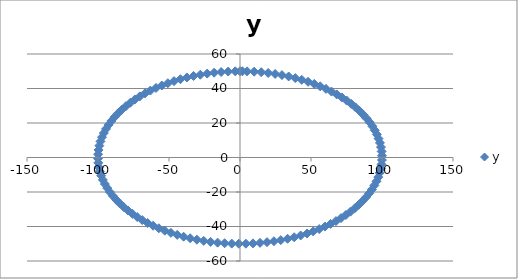
| Category | y |
|---|---|
| 0.0 | 50 |
| 4.997916927067833 | 49.938 |
| 9.983341664682815 | 49.75 |
| 14.943813247359921 | 49.439 |
| 19.866933079506122 | 49.003 |
| 24.740395925452294 | 48.446 |
| 29.552020666133956 | 47.767 |
| 34.28978074554514 | 46.969 |
| 38.941834230865055 | 46.053 |
| 43.496553411123024 | 45.022 |
| 47.942553860420304 | 43.879 |
| 52.26872289306592 | 42.626 |
| 56.46424733950354 | 41.267 |
| 60.51864057360395 | 39.804 |
| 64.4217687237691 | 38.242 |
| 68.16387600233341 | 36.584 |
| 71.73560908995228 | 34.835 |
| 75.12804051402927 | 32.999 |
| 78.33269096274834 | 31.08 |
| 81.34155047893738 | 29.084 |
| 84.14709848078965 | 27.015 |
| 86.7423225594017 | 24.879 |
| 89.12073600614355 | 22.68 |
| 91.2763940260521 | 20.424 |
| 93.20390859672263 | 18.118 |
| 94.89846193555861 | 15.766 |
| 96.3558185417193 | 13.375 |
| 97.5723357826659 | 10.95 |
| 98.54497299884602 | 8.498 |
| 99.27129910375885 | 6.025 |
| 99.74949866040545 | 3.537 |
| 99.9783764189357 | 1.04 |
| 99.95736030415051 | -1.46 |
| 99.68650284539189 | -3.956 |
| 99.16648104524685 | -6.442 |
| 98.3985946873937 | -8.912 |
| 97.38476308781952 | -11.36 |
| 96.12752029752998 | -13.78 |
| 94.63000876874145 | -16.164 |
| 92.89597150038693 | -18.509 |
| 90.92974268256818 | -20.807 |
| 88.73623686333755 | -23.054 |
| 86.32093666488737 | -25.242 |
| 83.68987907984977 | -27.368 |
| 80.849640381959 | -29.425 |
| 77.80731968879212 | -31.409 |
| 74.57052121767202 | -33.314 |
| 71.14733527908443 | -35.136 |
| 67.5463180551151 | -36.87 |
| 63.77647021345037 | -38.512 |
| 59.84721441039566 | -40.057 |
| 55.7683717391417 | -41.503 |
| 51.550137182146415 | -42.844 |
| 47.20305412898826 | -44.079 |
| 42.737988023382975 | -45.204 |
| 38.16609920523317 | -46.215 |
| 33.49881501559051 | -47.111 |
| 28.74780123425444 | -47.889 |
| 23.92493292139824 | -48.548 |
| 19.042264736102705 | -49.085 |
| 14.112000805986721 | -49.5 |
| 9.146464223243719 | -49.79 |
| 4.158066243329049 | -49.957 |
| -0.8407247367148618 | -49.998 |
| -5.8374143427580085 | -49.915 |
| -10.819513453010837 | -49.706 |
| -15.774569414324821 | -49.374 |
| -20.690197167339978 | -48.918 |
| -25.554110202683123 | -48.34 |
| -30.354151270842934 | -47.641 |
| -35.07832276896198 | -46.823 |
| -39.71481672859598 | -45.888 |
| -44.252044329485244 | -44.838 |
| -48.678664865569935 | -43.676 |
| -52.98361409084934 | -42.405 |
| -57.156131874234376 | -41.028 |
| -61.18578909427189 | -39.548 |
| -65.06251370651674 | -37.97 |
| -68.77661591839738 | -36.297 |
| -72.31881240865121 | -34.533 |
| -75.68024953079282 | -32.682 |
| -78.85252544261951 | -30.75 |
| -81.82771110644103 | -28.741 |
| -84.59837010754465 | -26.66 |
| -87.15757724135882 | -24.513 |
| -89.49893582285836 | -22.304 |
| -91.61659367494549 | -20.04 |
| -93.50525775584491 | -17.725 |
| -95.1602073889516 | -15.367 |
| -96.57730606206388 | -12.969 |
| -97.7530117665097 | -10.54 |
| -98.68438585032365 | -8.084 |
| -99.36910036334645 | -5.608 |
| -99.80544387588795 | -3.117 |
| -99.99232575641008 | -0.619 |
| -99.9292788975378 | 1.88 |
| -99.61646088358407 | 4.375 |
| -99.05465359667133 | 6.859 |
| -98.24526126243325 | 9.326 |
| -97.19030694018208 | 11.769 |
| -95.89242746631385 | 14.183 |
| -94.35486686359066 | 16.562 |
| -92.58146823277325 | 18.899 |
| -90.57666414687044 | 21.189 |
| -88.34546557201531 | 23.426 |
| -85.8934493426592 | 25.604 |
| -83.22674422239012 | 27.719 |
| -80.35201558521558 | 29.764 |
| -77.27644875559872 | 31.735 |
| -74.00773104888944 | 33.626 |
| -70.55403255703919 | 35.433 |
| -66.9239857276262 | 37.152 |
| -63.12666378723216 | 38.778 |
| -59.17155806310094 | 40.307 |
| -55.06855425976376 | 41.736 |
| -50.827907749925835 | 43.06 |
| -46.46021794137574 | 44.276 |
| -41.97640178398597 | 45.382 |
| -37.3876664830236 | 46.374 |
| -32.705481486974065 | 47.25 |
| -27.941549819892586 | 48.009 |
| -23.107778829939225 | 48.647 |
| -18.216250427209587 | 49.163 |
| -13.279190885251674 | 49.557 |
| -8.30894028174964 | 49.827 |
| -3.317921654755682 | 49.972 |
| 1.6813900484349713 | 49.993 |